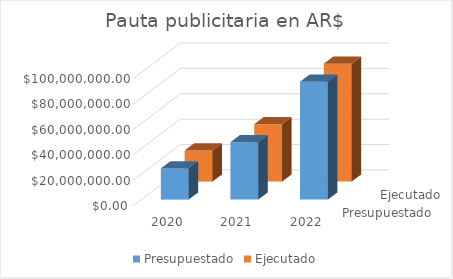
| Category | Presupuestado | Ejecutado |
|---|---|---|
| 2020.0 | 24498414.04 | 24498414.04 |
| 2021.0 | 45237482.19 | 45237482.19 |
| 2022.0 | 92785187.63 | 92785187.63 |